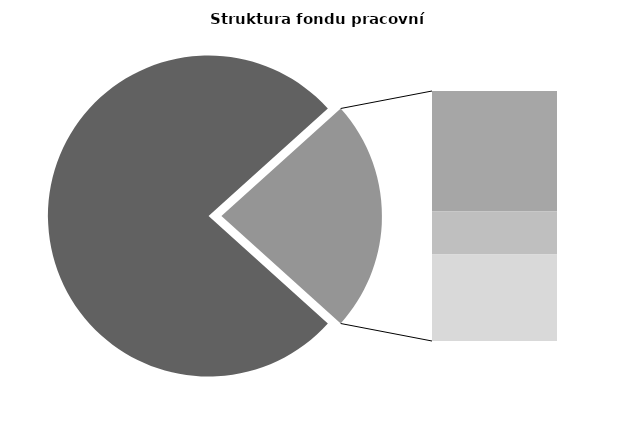
| Category | Series 0 |
|---|---|
| Průměrná měsíční odpracovaná doba bez přesčasu | 132.987 |
| Dovolená | 19.543 |
| Nemoc | 6.937 |
| Jiné | 14.033 |